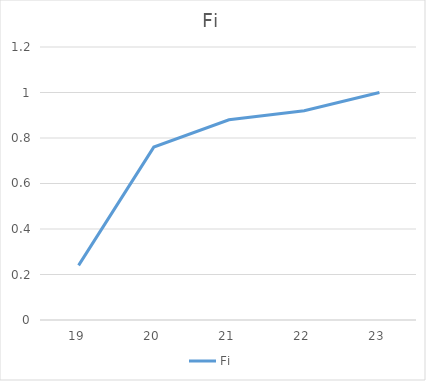
| Category | Fi |
|---|---|
| 19.0 | 0.24 |
| 20.0 | 0.76 |
| 21.0 | 0.88 |
| 22.0 | 0.92 |
| 23.0 | 1 |